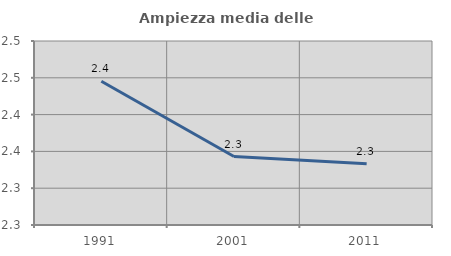
| Category | Ampiezza media delle famiglie |
|---|---|
| 1991.0 | 2.445 |
| 2001.0 | 2.343 |
| 2011.0 | 2.333 |